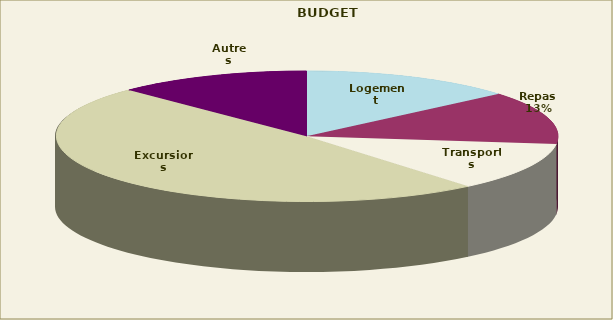
| Category | Series 0 |
|---|---|
| Logement | 117.01 |
| Repas | 111.051 |
| Transports | 102.126 |
| Excursions | 412.412 |
| Autres | 105.964 |